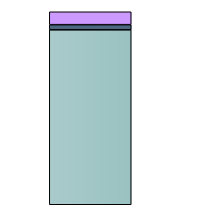
| Category | Series 0 | Series 1 | Series 2 |
|---|---|---|---|
| 0 | 765367 | 22551 | 56507 |